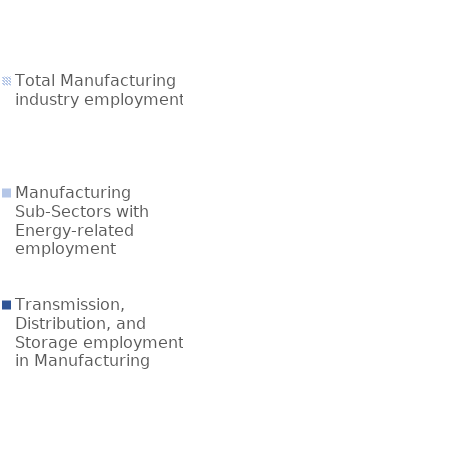
| Category | Total Manufacturing industry employment | Manufacturing Sub-Sectors with Energy-related employment | Transmission, Distribution, and Storage employment in Manufacturing |
|---|---|---|---|
| Manufacturing | 12303630 | 828983 | 90732.928 |